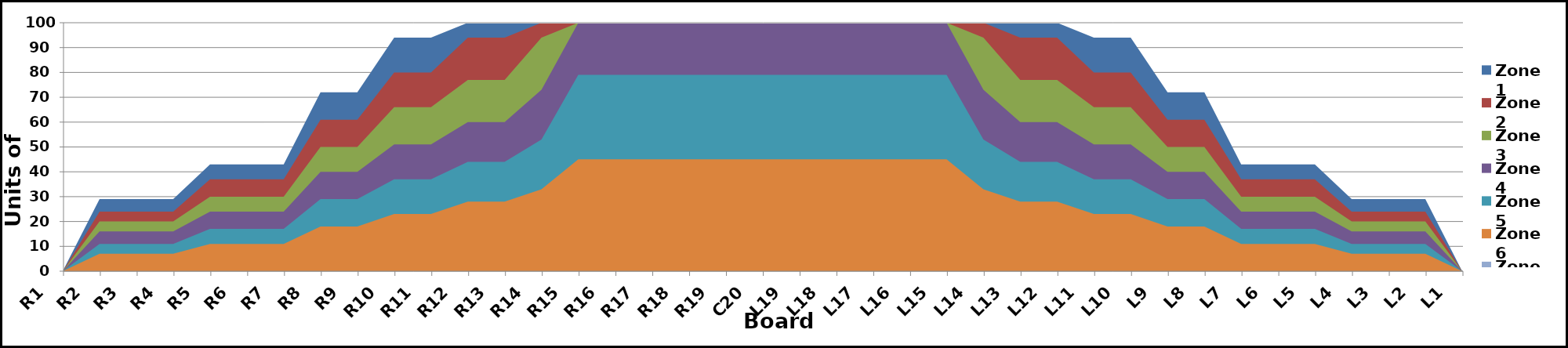
| Category | Zone 1 | Zone 2 | Zone 3 | Zone 4 | Zone 5 | Zone 6 | Zone 7 | Zone 8 |
|---|---|---|---|---|---|---|---|---|
| L1 | 0 | 0 | 0 | 0 | 0 | 0 | 0 | 0 |
| L2 | 29 | 24 | 20 | 16 | 11 | 7 | 0 | 0 |
| L3 | 29 | 24 | 20 | 16 | 11 | 7 | 0 | 0 |
| L4 | 29 | 24 | 20 | 16 | 11 | 7 | 0 | 0 |
| L5 | 43 | 37 | 30 | 24 | 17 | 11 | 0 | 0 |
| L6 | 43 | 37 | 30 | 24 | 17 | 11 | 0 | 0 |
| L7 | 43 | 37 | 30 | 24 | 17 | 11 | 0 | 0 |
| L8 | 72 | 61 | 50 | 40 | 29 | 18 | 0 | 0 |
| L9 | 72 | 61 | 50 | 40 | 29 | 18 | 0 | 0 |
| L10 | 94 | 80 | 66 | 51 | 37 | 23 | 0 | 0 |
| L11 | 94 | 80 | 66 | 51 | 37 | 23 | 0 | 0 |
| L12 | 100 | 94 | 77 | 60 | 44 | 28 | 0 | 0 |
| L13 | 100 | 94 | 77 | 60 | 44 | 28 | 0 | 0 |
| L14 | 100 | 100 | 94 | 73 | 53 | 33 | 0 | 0 |
| L15 | 100 | 100 | 100 | 100 | 79 | 45 | 0 | 0 |
| L16 | 100 | 100 | 100 | 100 | 79 | 45 | 0 | 0 |
| L17 | 100 | 100 | 100 | 100 | 79 | 45 | 0 | 0 |
| L18 | 100 | 100 | 100 | 100 | 79 | 45 | 0 | 0 |
| L19 | 100 | 100 | 100 | 100 | 79 | 45 | 0 | 0 |
| C20 | 100 | 100 | 100 | 100 | 79 | 45 | 0 | 0 |
| R19 | 100 | 100 | 100 | 100 | 79 | 45 | 0 | 0 |
| R18 | 100 | 100 | 100 | 100 | 79 | 45 | 0 | 0 |
| R17 | 100 | 100 | 100 | 100 | 79 | 45 | 0 | 0 |
| R16 | 100 | 100 | 100 | 100 | 79 | 45 | 0 | 0 |
| R15 | 100 | 100 | 100 | 100 | 79 | 45 | 0 | 0 |
| R14 | 100 | 100 | 94 | 73 | 53 | 33 | 0 | 0 |
| R13 | 100 | 94 | 77 | 60 | 44 | 28 | 0 | 0 |
| R12 | 100 | 94 | 77 | 60 | 44 | 28 | 0 | 0 |
| R11 | 94 | 80 | 66 | 51 | 37 | 23 | 0 | 0 |
| R10 | 94 | 80 | 66 | 51 | 37 | 23 | 0 | 0 |
| R9 | 72 | 61 | 50 | 40 | 29 | 18 | 0 | 0 |
| R8 | 72 | 61 | 50 | 40 | 29 | 18 | 0 | 0 |
| R7 | 43 | 37 | 30 | 24 | 17 | 11 | 0 | 0 |
| R6 | 43 | 37 | 30 | 24 | 17 | 11 | 0 | 0 |
| R5 | 43 | 37 | 30 | 24 | 17 | 11 | 0 | 0 |
| R4 | 29 | 24 | 20 | 16 | 11 | 7 | 0 | 0 |
| R3 | 29 | 24 | 20 | 16 | 11 | 7 | 0 | 0 |
| R2 | 29 | 24 | 20 | 16 | 11 | 7 | 0 | 0 |
| R1 | 0 | 0 | 0 | 0 | 0 | 0 | 0 | 0 |